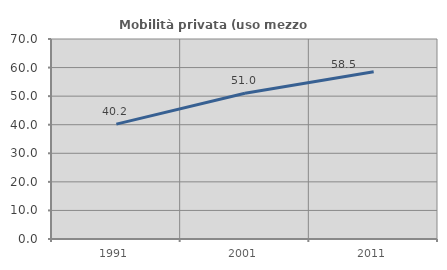
| Category | Mobilità privata (uso mezzo privato) |
|---|---|
| 1991.0 | 40.202 |
| 2001.0 | 51.013 |
| 2011.0 | 58.509 |